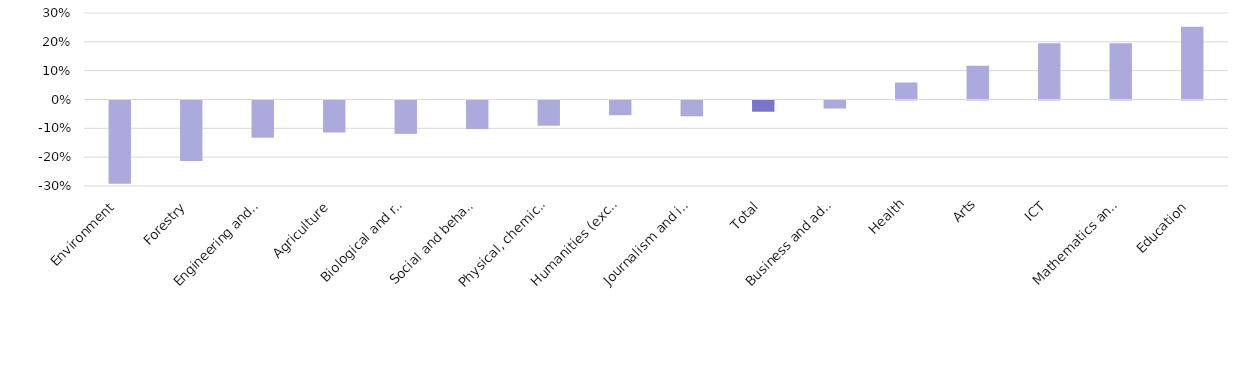
| Category | Series 0 |
|---|---|
| Environment | -0.288 |
| Forestry | -0.21 |
| Engineering and engineering trades | -0.129 |
| Agriculture | -0.111 |
| Biological and related sciences | -0.116 |
| Social and behavioural sciences | -0.099 |
| Physical, chemical and earth sciences | -0.088 |
| Humanities (except languages) | -0.051 |
| Journalism and information | -0.055 |
| Total | -0.039 |
| Business and administration | -0.028 |
| Health | 0.059 |
| Arts | 0.117 |
| ICT | 0.195 |
| Mathematics and statistics | 0.195 |
| Education | 0.252 |